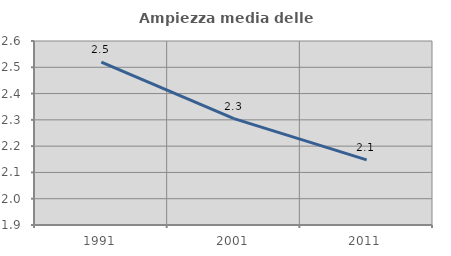
| Category | Ampiezza media delle famiglie |
|---|---|
| 1991.0 | 2.52 |
| 2001.0 | 2.305 |
| 2011.0 | 2.148 |